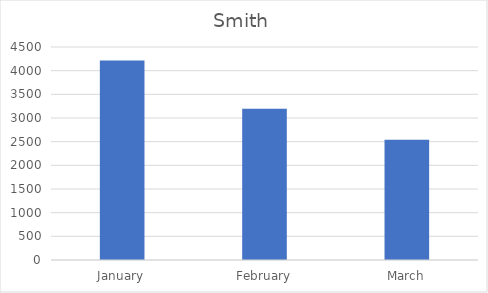
| Category | Smith |
|---|---|
| January | 4213 |
| February | 3194 |
| March | 2541 |